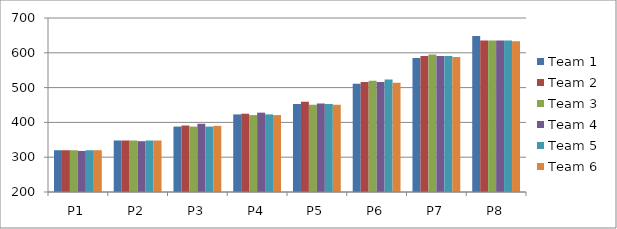
| Category | Team 1 | Team 2 | Team 3 | Team 4 | Team 5 | Team 6 |
|---|---|---|---|---|---|---|
| P1 | 320 | 320 | 320 | 318 | 320 | 320 |
| P2 | 348 | 348 | 348 | 346 | 348 | 348 |
| P3 | 388 | 391 | 388 | 396 | 388 | 390 |
| P4 | 423 | 425 | 421 | 428 | 423 | 421 |
| P5 | 453 | 459 | 451 | 454 | 453 | 451 |
| P6 | 511 | 516 | 520 | 516 | 523 | 514 |
| P7 | 585 | 591 | 595 | 591 | 591 | 588 |
| P8 | 648 | 635 | 635 | 635 | 635 | 633 |